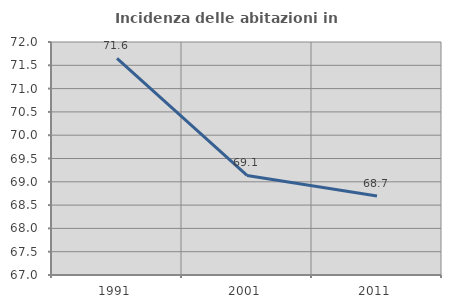
| Category | Incidenza delle abitazioni in proprietà  |
|---|---|
| 1991.0 | 71.648 |
| 2001.0 | 69.137 |
| 2011.0 | 68.695 |